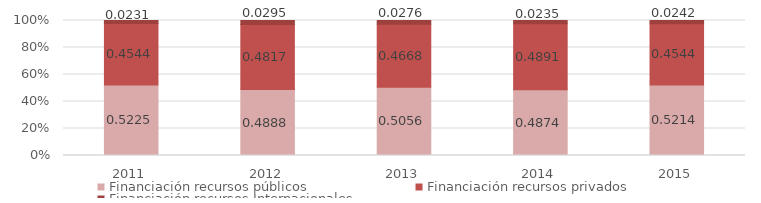
| Category | Financiación recursos públicos | Financiación recursos privados | Financiación recursos Internacionales |
|---|---|---|---|
| 2011.0 | 0.522 | 0.454 | 0.023 |
| 2012.0 | 0.489 | 0.482 | 0.03 |
| 2013.0 | 0.506 | 0.467 | 0.028 |
| 2014.0 | 0.487 | 0.489 | 0.024 |
| 2015.0 | 0.521 | 0.454 | 0.024 |